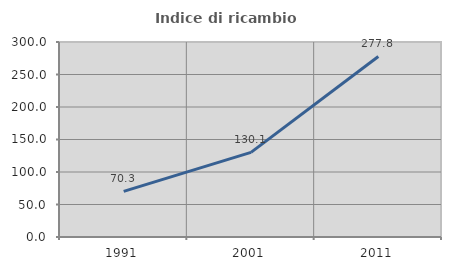
| Category | Indice di ricambio occupazionale  |
|---|---|
| 1991.0 | 70.292 |
| 2001.0 | 130.147 |
| 2011.0 | 277.79 |